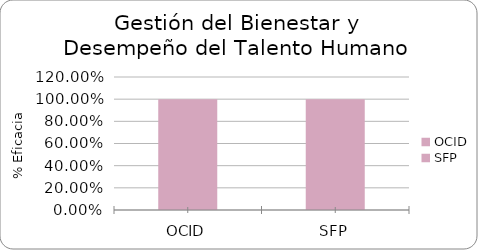
| Category | % Eficacia total |
|---|---|
| OCID | 1 |
| SFP | 1 |